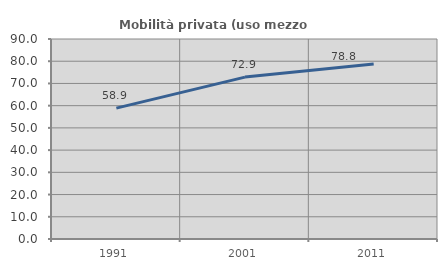
| Category | Mobilità privata (uso mezzo privato) |
|---|---|
| 1991.0 | 58.904 |
| 2001.0 | 72.857 |
| 2011.0 | 78.752 |